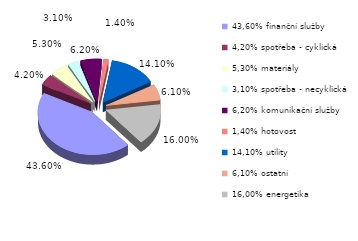
| Category | Series 0 |
|---|---|
| 43,60% finanční služby | 0.436 |
| 4,20% spotřeba - cyklická | 0.042 |
| 5,30% materiály | 0.053 |
| 3,10% spotřeba - necyklická | 0.031 |
| 6,20% komunikační služby | 0.062 |
| 1,40% hotovost | 0.014 |
| 14,10% utility | 0.141 |
| 6,10% ostatní | 0.061 |
| 16,00% energetika | 0.16 |